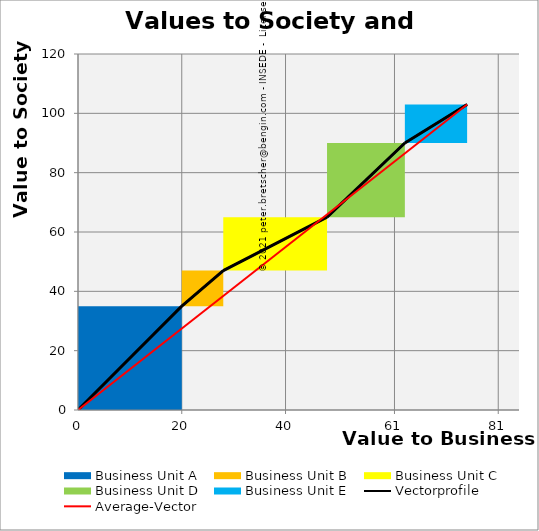
| Category | transparent | Business Unit A | Business Unit B | Business Unit C | Business Unit D | Business Unit E | none | Border right & top |
|---|---|---|---|---|---|---|---|---|
| 0.0 | 0 | 35 | 0 | 0 | 0 | 0 | 0 | 0 |
| 20.0 | 0 | 35 | 0 | 0 | 0 | 0 | 0 | 0 |
| 20.0 | 35 | 0 | 12 | 0 | 0 | 0 | 0 | 0 |
| 28.0 | 35 | 0 | 12 | 0 | 0 | 0 | 0 | 0 |
| 28.0 | 47 | 0 | 0 | 18 | 0 | 0 | 0 | 0 |
| 48.0 | 47 | 0 | 0 | 18 | 0 | 0 | 0 | 0 |
| 48.0 | 65 | 0 | 0 | 0 | 25 | 0 | 0 | 0 |
| 63.0 | 65 | 0 | 0 | 0 | 25 | 0 | 0 | 0 |
| 63.0 | 90 | 0 | 0 | 0 | 0 | 13 | 0 | 0 |
| 75.0 | 90 | 0 | 0 | 0 | 0 | 13 | 0 | 0 |
| 75.0 | 103 | 0 | 0 | 0 | 0 | 0 | 0 | 0 |
| 75.0 | 103 | 0 | 0 | 0 | 0 | 0 | 0 | 0 |
| 75.0 | 103 | 0 | 0 | 0 | 0 | 0 | 0 | 0 |
| 75.0 | 103 | 0 | 0 | 0 | 0 | 0 | 0 | 0 |
| 75.0 | 103 | 0 | 0 | 0 | 0 | 0 | 0 | 0 |
| 75.0 | 103 | 0 | 0 | 0 | 0 | 0 | 0 | 0 |
| 75.0 | 103 | 0 | 0 | 0 | 0 | 0 | 0 | 0 |
| 75.0 | 103 | 0 | 0 | 0 | 0 | 0 | 0 | 0 |
| 75.0 | 103 | 0 | 0 | 0 | 0 | 0 | 0 | 0 |
| 75.0 | 103 | 0 | 0 | 0 | 0 | 0 | 0 | 0 |
| 75.0 | 103 | 0 | 0 | 0 | 0 | 0 | 0 | 0 |
| 85.0 | 103 | 0 | 0 | 0 | 0 | 0 | 0 | 0 |
| 85.0 | 103 | 0 | 0 | 0 | 0 | 0 | 0 | 0 |